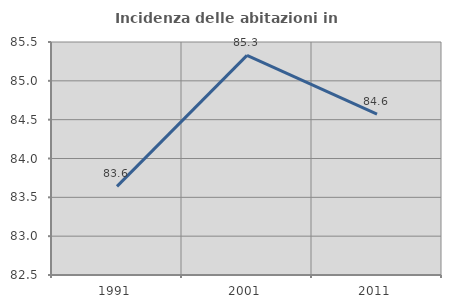
| Category | Incidenza delle abitazioni in proprietà  |
|---|---|
| 1991.0 | 83.642 |
| 2001.0 | 85.328 |
| 2011.0 | 84.57 |